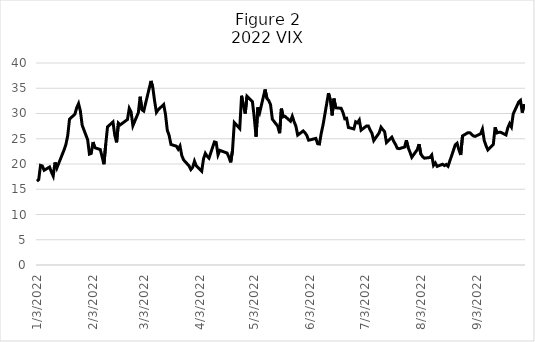
| Category | Series 0 |
|---|---|
| 1/3/22 | 16.6 |
| 1/4/22 | 16.91 |
| 1/5/22 | 19.73 |
| 1/6/22 | 19.61 |
| 1/7/22 | 18.76 |
| 1/10/22 | 19.4 |
| 1/11/22 | 18.41 |
| 1/12/22 | 17.62 |
| 1/13/22 | 20.31 |
| 1/14/22 | 19.19 |
| 1/18/22 | 22.79 |
| 1/19/22 | 23.85 |
| 1/20/22 | 25.59 |
| 1/21/22 | 28.85 |
| 1/24/22 | 29.9 |
| 1/25/22 | 31.16 |
| 1/26/22 | 31.96 |
| 1/27/22 | 30.49 |
| 1/28/22 | 27.66 |
| 1/31/22 | 24.83 |
| 2/1/22 | 21.96 |
| 2/2/22 | 22.09 |
| 2/3/22 | 24.35 |
| 2/4/22 | 23.22 |
| 2/7/22 | 22.86 |
| 2/8/22 | 21.44 |
| 2/9/22 | 19.96 |
| 2/10/22 | 23.91 |
| 2/11/22 | 27.36 |
| 2/14/22 | 28.33 |
| 2/15/22 | 25.7 |
| 2/16/22 | 24.29 |
| 2/17/22 | 28.11 |
| 2/18/22 | 27.75 |
| 2/22/22 | 28.81 |
| 2/23/22 | 31.02 |
| 2/24/22 | 30.32 |
| 2/25/22 | 27.59 |
| 2/28/22 | 30.15 |
| 3/1/22 | 33.32 |
| 3/2/22 | 30.74 |
| 3/3/22 | 30.48 |
| 3/4/22 | 31.98 |
| 3/7/22 | 36.45 |
| 3/8/22 | 35.13 |
| 3/9/22 | 32.45 |
| 3/10/22 | 30.23 |
| 3/11/22 | 30.75 |
| 3/14/22 | 31.77 |
| 3/15/22 | 29.83 |
| 3/16/22 | 26.67 |
| 3/17/22 | 25.67 |
| 3/18/22 | 23.87 |
| 3/21/22 | 23.53 |
| 3/22/22 | 22.94 |
| 3/23/22 | 23.57 |
| 3/24/22 | 21.67 |
| 3/25/22 | 20.81 |
| 3/28/22 | 19.63 |
| 3/29/22 | 18.9 |
| 3/30/22 | 19.33 |
| 3/31/22 | 20.56 |
| 4/1/22 | 19.63 |
| 4/4/22 | 18.57 |
| 4/5/22 | 21.03 |
| 4/6/22 | 22.1 |
| 4/7/22 | 21.55 |
| 4/8/22 | 21.16 |
| 4/11/22 | 24.37 |
| 4/12/22 | 24.26 |
| 4/13/22 | 21.82 |
| 4/14/22 | 22.7 |
| 4/18/22 | 22.17 |
| 4/19/22 | 21.37 |
| 4/20/22 | 20.32 |
| 4/21/22 | 22.68 |
| 4/22/22 | 28.21 |
| 4/25/22 | 27.02 |
| 4/26/22 | 33.52 |
| 4/27/22 | 31.6 |
| 4/28/22 | 29.99 |
| 4/29/22 | 33.4 |
| 5/2/22 | 32.34 |
| 5/3/22 | 29.25 |
| 5/4/22 | 25.42 |
| 5/5/22 | 31.2 |
| 5/6/22 | 30.19 |
| 5/9/22 | 34.75 |
| 5/10/22 | 32.99 |
| 5/11/22 | 32.56 |
| 5/12/22 | 31.77 |
| 5/13/22 | 28.87 |
| 5/16/22 | 27.47 |
| 5/17/22 | 26.1 |
| 5/18/22 | 30.96 |
| 5/19/22 | 29.35 |
| 5/20/22 | 29.43 |
| 5/23/22 | 28.48 |
| 5/24/22 | 29.45 |
| 5/25/22 | 28.37 |
| 5/26/22 | 27.5 |
| 5/27/22 | 25.72 |
| 5/30/22 | 26.54 |
| 5/31/22 | 26.19 |
| 6/1/22 | 25.69 |
| 6/2/22 | 24.72 |
| 6/3/22 | 24.79 |
| 6/6/22 | 25.07 |
| 6/7/22 | 24.02 |
| 6/8/22 | 23.96 |
| 6/9/22 | 26.09 |
| 6/10/22 | 27.75 |
| 6/13/22 | 34.02 |
| 6/14/22 | 32.69 |
| 6/15/22 | 29.62 |
| 6/16/22 | 32.95 |
| 6/17/22 | 31.13 |
| 6/20/22 | 31.03 |
| 6/21/22 | 30.19 |
| 6/22/22 | 28.95 |
| 6/23/22 | 29.05 |
| 6/24/22 | 27.23 |
| 6/27/22 | 26.95 |
| 6/28/22 | 28.36 |
| 6/29/22 | 28.16 |
| 6/30/22 | 28.71 |
| 7/1/22 | 26.7 |
| 7/4/22 | 27.53 |
| 7/5/22 | 27.54 |
| 7/6/22 | 26.73 |
| 7/7/22 | 26.08 |
| 7/8/22 | 24.64 |
| 7/11/22 | 26.17 |
| 7/12/22 | 27.29 |
| 7/13/22 | 26.82 |
| 7/14/22 | 26.4 |
| 7/15/22 | 24.23 |
| 7/18/22 | 25.3 |
| 7/19/22 | 24.5 |
| 7/20/22 | 23.88 |
| 7/21/22 | 23.11 |
| 7/22/22 | 23.03 |
| 7/25/22 | 23.36 |
| 7/26/22 | 24.69 |
| 7/27/22 | 23.24 |
| 7/28/22 | 22.33 |
| 7/29/22 | 21.33 |
| 8/1/22 | 22.84 |
| 8/2/22 | 23.93 |
| 8/3/22 | 21.95 |
| 8/4/22 | 21.44 |
| 8/5/22 | 21.15 |
| 8/8/22 | 21.29 |
| 8/9/22 | 21.77 |
| 8/10/22 | 19.74 |
| 8/11/22 | 20.2 |
| 8/12/22 | 19.53 |
| 8/15/22 | 19.95 |
| 8/16/22 | 19.69 |
| 8/17/22 | 19.9 |
| 8/18/22 | 19.56 |
| 8/19/22 | 20.6 |
| 8/22/22 | 23.8 |
| 8/23/22 | 24.11 |
| 8/24/22 | 22.82 |
| 8/25/22 | 21.78 |
| 8/26/22 | 25.56 |
| 8/29/22 | 26.21 |
| 8/30/22 | 26.21 |
| 8/31/22 | 25.87 |
| 9/1/22 | 25.56 |
| 9/2/22 | 25.47 |
| 9/5/22 | 25.99 |
| 9/6/22 | 26.91 |
| 9/7/22 | 24.64 |
| 9/8/22 | 23.61 |
| 9/9/22 | 22.79 |
| 9/12/22 | 23.87 |
| 9/13/22 | 27.27 |
| 9/14/22 | 26.16 |
| 9/15/22 | 26.27 |
| 9/16/22 | 26.3 |
| 9/19/22 | 25.76 |
| 9/20/22 | 27.16 |
| 9/21/22 | 27.99 |
| 9/22/22 | 27.35 |
| 9/23/22 | 29.92 |
| 9/26/22 | 32.26 |
| 9/27/22 | 32.6 |
| 9/28/22 | 30.18 |
| 9/29/22 | 31.84 |